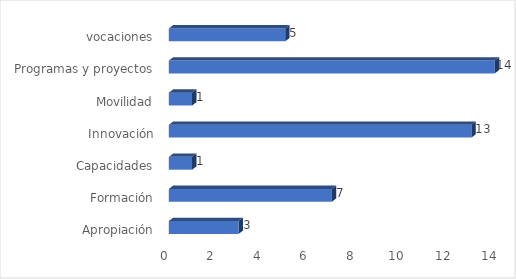
| Category | Series 0 |
|---|---|
| Apropiación | 3 |
| Formación | 7 |
| Capacidades | 1 |
| Innovación | 13 |
| Movilidad | 1 |
| Programas y proyectos | 14 |
| vocaciones | 5 |